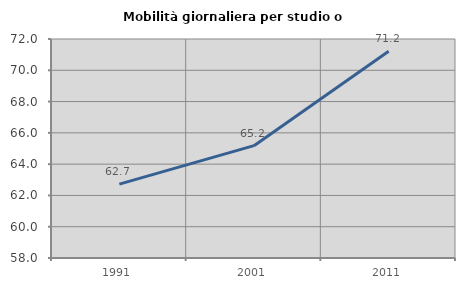
| Category | Mobilità giornaliera per studio o lavoro |
|---|---|
| 1991.0 | 62.721 |
| 2001.0 | 65.181 |
| 2011.0 | 71.214 |